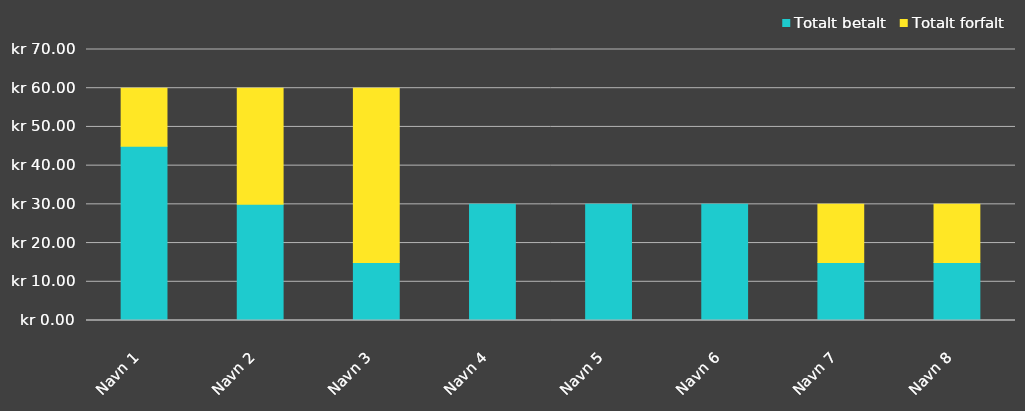
| Category | Totalt betalt | Totalt forfalt |
|---|---|---|
| Navn 1 | 45 | 15 |
| Navn 2 | 30 | 30 |
| Navn 3 | 15 | 45 |
| Navn 4 | 30 | 0 |
| Navn 5 | 30 | 0 |
| Navn 6 | 30 | 0 |
| Navn 7 | 15 | 15 |
| Navn 8 | 15 | 15 |